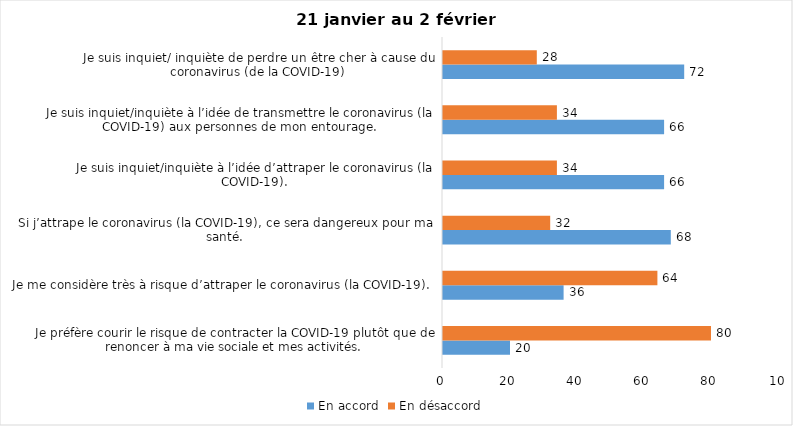
| Category | En accord | En désaccord |
|---|---|---|
| Je préfère courir le risque de contracter la COVID-19 plutôt que de renoncer à ma vie sociale et mes activités. | 20 | 80 |
| Je me considère très à risque d’attraper le coronavirus (la COVID-19). | 36 | 64 |
| Si j’attrape le coronavirus (la COVID-19), ce sera dangereux pour ma santé. | 68 | 32 |
| Je suis inquiet/inquiète à l’idée d’attraper le coronavirus (la COVID-19). | 66 | 34 |
| Je suis inquiet/inquiète à l’idée de transmettre le coronavirus (la COVID-19) aux personnes de mon entourage. | 66 | 34 |
| Je suis inquiet/ inquiète de perdre un être cher à cause du coronavirus (de la COVID-19) | 72 | 28 |